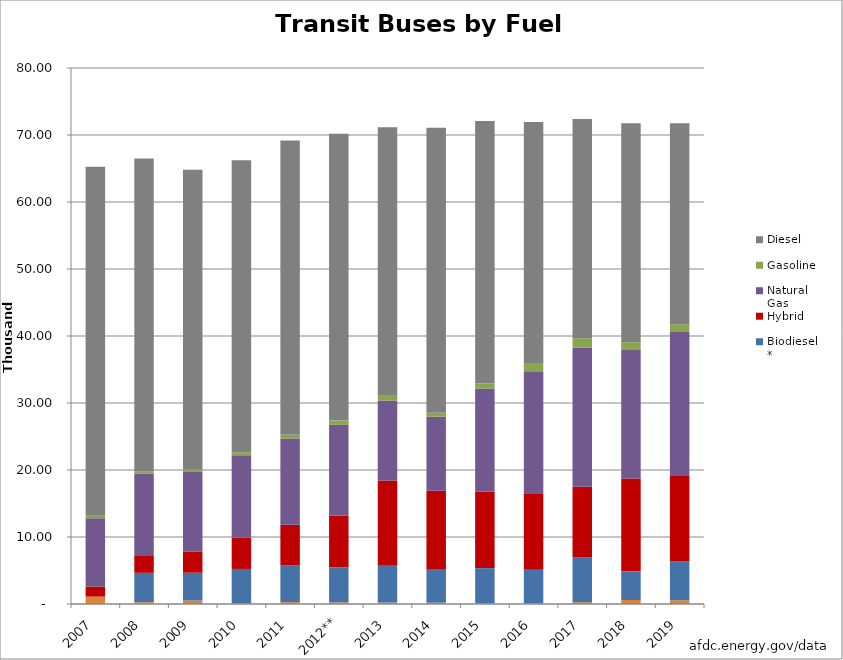
| Category | Other | Biodiesel* | Hybrid | Natural Gas | Gasoline | Diesel |
|---|---|---|---|---|---|---|
| 2007 | 1109.233 | 0 | 1500.727 | 10178.844 | 391.494 | 52068.702 |
| 2008 | 266.024 | 4389.396 | 2527.228 | 12303.61 | 332.53 | 46687.212 |
| 2009 | 518.656 | 4149.248 | 3176.768 | 11864.256 | 453.824 | 44669.248 |
| 2010 | 132.478 | 5100.403 | 4636.73 | 12320.454 | 463.673 | 43585.262 |
| 2011 | 276.7 | 5464.825 | 6087.4 | 12866.55 | 553.4 | 43926.125 |
|   2012** | 245.654 | 5228.932 | 7720.57 | 13546.091 | 666.776 | 42778.976 |
| 2013 | 213.417 | 5477.703 | 12733.881 | 11951.352 | 711.39 | 40051.257 |
| 2014 | 195.039 | 5030.213 | 11691.804 | 11031.138 | 650.13 | 42467.676 |
| 2015 | 132.04 | 5223.39 | 11414.858 | 15391.271 | 773.449 | 39139.933 |
| 2016 | 132.784 | 4990.904 | 11391.98 | 18218.552 | 1130.544 | 36091.217 |
| 2017 | 266.104 | 6662.267 | 10557.996 | 20799.729 | 1382.965 | 32717.939 |
| 2018 | 597.366 | 4274.781 | 13872.166 | 19150.678 | 1177.619 | 32670.643 |
| 2019 | 556.728 | 5849.945 | 12696.404 | 21486.387 | 1165.828 | 29988.68 |